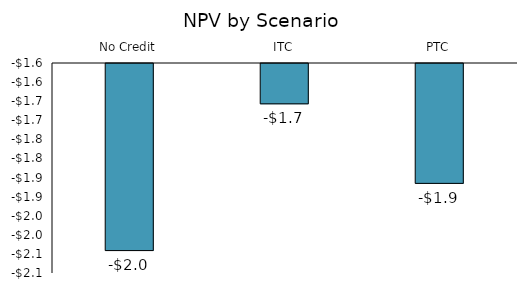
| Category | Series 0 |
|---|---|
| No Credit | -2039981.392 |
| ITC | -1655659.547 |
| PTC | -1863978.508 |